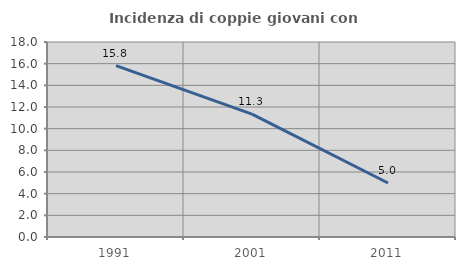
| Category | Incidenza di coppie giovani con figli |
|---|---|
| 1991.0 | 15.812 |
| 2001.0 | 11.338 |
| 2011.0 | 4.988 |